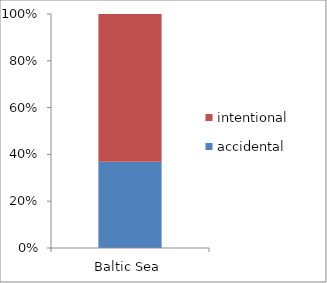
| Category | accidental | intentional |
|---|---|---|
| Baltic Sea | 33172.75 | 56730.5 |